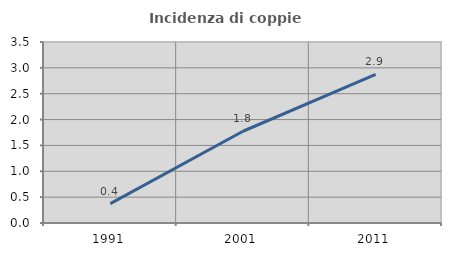
| Category | Incidenza di coppie miste |
|---|---|
| 1991.0 | 0.374 |
| 2001.0 | 1.774 |
| 2011.0 | 2.872 |